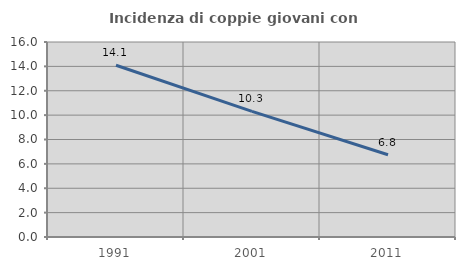
| Category | Incidenza di coppie giovani con figli |
|---|---|
| 1991.0 | 14.092 |
| 2001.0 | 10.307 |
| 2011.0 | 6.752 |